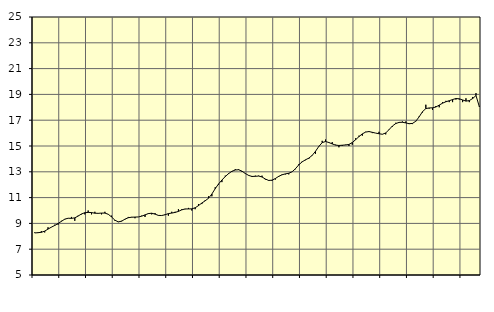
| Category | Piggar | Finansiell verksamhet, företagstjänster, SNI 64-82 |
|---|---|---|
| nan | 8.3 | 8.26 |
| 87.0 | 8.3 | 8.28 |
| 87.0 | 8.4 | 8.31 |
| 87.0 | 8.3 | 8.4 |
| nan | 8.7 | 8.56 |
| 88.0 | 8.7 | 8.71 |
| 88.0 | 8.9 | 8.84 |
| 88.0 | 8.9 | 8.99 |
| nan | 9.2 | 9.16 |
| 89.0 | 9.3 | 9.33 |
| 89.0 | 9.4 | 9.4 |
| 89.0 | 9.5 | 9.39 |
| nan | 9.2 | 9.43 |
| 90.0 | 9.6 | 9.57 |
| 90.0 | 9.7 | 9.73 |
| 90.0 | 9.7 | 9.83 |
| nan | 10 | 9.85 |
| 91.0 | 9.7 | 9.84 |
| 91.0 | 9.9 | 9.79 |
| 91.0 | 9.8 | 9.78 |
| nan | 9.7 | 9.8 |
| 92.0 | 9.9 | 9.8 |
| 92.0 | 9.7 | 9.71 |
| 92.0 | 9.6 | 9.5 |
| nan | 9.2 | 9.25 |
| 93.0 | 9.1 | 9.12 |
| 93.0 | 9.2 | 9.17 |
| 93.0 | 9.3 | 9.33 |
| nan | 9.5 | 9.44 |
| 94.0 | 9.5 | 9.48 |
| 94.0 | 9.4 | 9.49 |
| 94.0 | 9.5 | 9.5 |
| nan | 9.6 | 9.56 |
| 95.0 | 9.5 | 9.66 |
| 95.0 | 9.8 | 9.76 |
| 95.0 | 9.7 | 9.79 |
| nan | 9.8 | 9.72 |
| 96.0 | 9.6 | 9.62 |
| 96.0 | 9.6 | 9.61 |
| 96.0 | 9.7 | 9.67 |
| nan | 9.6 | 9.76 |
| 97.0 | 9.9 | 9.8 |
| 97.0 | 9.9 | 9.85 |
| 97.0 | 10.1 | 9.93 |
| nan | 10.1 | 10.05 |
| 98.0 | 10.1 | 10.12 |
| 98.0 | 10.2 | 10.12 |
| 98.0 | 10 | 10.13 |
| nan | 10.1 | 10.21 |
| 99.0 | 10.5 | 10.38 |
| 99.0 | 10.5 | 10.58 |
| 99.0 | 10.8 | 10.75 |
| nan | 11.1 | 10.95 |
| 0.0 | 11.1 | 11.28 |
| 0.0 | 11.8 | 11.69 |
| 0.0 | 12 | 12.06 |
| nan | 12.2 | 12.36 |
| 1.0 | 12.7 | 12.63 |
| 1.0 | 12.9 | 12.86 |
| 1.0 | 13 | 13.04 |
| nan | 13.2 | 13.14 |
| 2.0 | 13.2 | 13.16 |
| 2.0 | 13 | 13.05 |
| 2.0 | 12.9 | 12.87 |
| nan | 12.7 | 12.72 |
| 3.0 | 12.6 | 12.64 |
| 3.0 | 12.7 | 12.65 |
| 3.0 | 12.7 | 12.67 |
| nan | 12.7 | 12.6 |
| 4.0 | 12.4 | 12.44 |
| 4.0 | 12.3 | 12.33 |
| 4.0 | 12.3 | 12.35 |
| nan | 12.4 | 12.48 |
| 5.0 | 12.6 | 12.65 |
| 5.0 | 12.8 | 12.77 |
| 5.0 | 12.8 | 12.84 |
| nan | 12.8 | 12.89 |
| 6.0 | 13 | 13 |
| 6.0 | 13.2 | 13.24 |
| 6.0 | 13.6 | 13.54 |
| nan | 13.8 | 13.77 |
| 7.0 | 13.9 | 13.93 |
| 7.0 | 14 | 14.06 |
| 7.0 | 14.3 | 14.27 |
| nan | 14.4 | 14.59 |
| 8.0 | 15 | 14.97 |
| 8.0 | 15.4 | 15.26 |
| 8.0 | 15.5 | 15.35 |
| nan | 15.3 | 15.27 |
| 9.0 | 15.3 | 15.16 |
| 9.0 | 15.1 | 15.07 |
| 9.0 | 14.9 | 15.04 |
| nan | 15 | 15.06 |
| 10.0 | 15.1 | 15.08 |
| 10.0 | 15 | 15.12 |
| 10.0 | 15.1 | 15.27 |
| nan | 15.6 | 15.49 |
| 11.0 | 15.8 | 15.73 |
| 11.0 | 15.8 | 15.94 |
| 11.0 | 16.1 | 16.08 |
| nan | 16.1 | 16.12 |
| 12.0 | 16 | 16.06 |
| 12.0 | 16 | 16 |
| 12.0 | 16.1 | 15.95 |
| nan | 15.9 | 15.91 |
| 13.0 | 15.9 | 16.01 |
| 13.0 | 16.3 | 16.27 |
| 13.0 | 16.5 | 16.55 |
| nan | 16.8 | 16.74 |
| 14.0 | 16.8 | 16.83 |
| 14.0 | 16.9 | 16.84 |
| 14.0 | 16.9 | 16.79 |
| nan | 16.7 | 16.73 |
| 15.0 | 16.7 | 16.75 |
| 15.0 | 16.9 | 16.92 |
| 15.0 | 17.3 | 17.26 |
| nan | 17.6 | 17.66 |
| 16.0 | 18.2 | 17.9 |
| 16.0 | 17.9 | 17.95 |
| 16.0 | 17.8 | 17.96 |
| nan | 18.1 | 18.02 |
| 17.0 | 18 | 18.17 |
| 17.0 | 18.4 | 18.32 |
| 17.0 | 18.5 | 18.43 |
| nan | 18.4 | 18.51 |
| 18.0 | 18.4 | 18.6 |
| 18.0 | 18.6 | 18.68 |
| 18.0 | 18.6 | 18.66 |
| nan | 18.4 | 18.57 |
| 19.0 | 18.7 | 18.48 |
| 19.0 | 18.4 | 18.52 |
| 19.0 | 18.8 | 18.68 |
| nan | 19.1 | 18.91 |
| 20.0 | 18.1 | 18.05 |